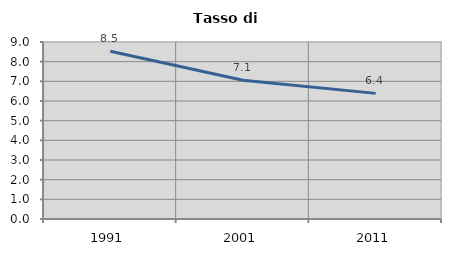
| Category | Tasso di disoccupazione   |
|---|---|
| 1991.0 | 8.53 |
| 2001.0 | 7.059 |
| 2011.0 | 6.388 |